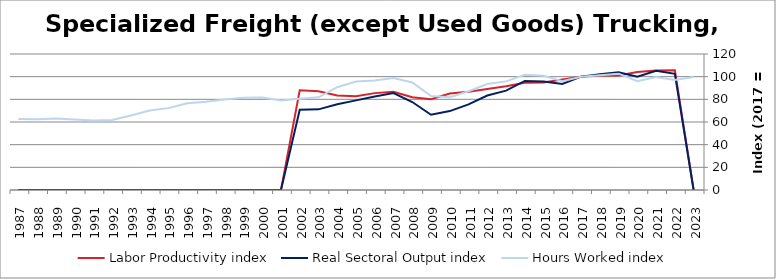
| Category | Labor Productivity index | Real Sectoral Output index | Hours Worked index |
|---|---|---|---|
| 2023.0 | 0 | 0 | 99.659 |
| 2022.0 | 105.584 | 102.556 | 97.131 |
| 2021.0 | 105.483 | 105.259 | 99.788 |
| 2020.0 | 104.042 | 99.897 | 96.016 |
| 2019.0 | 101.125 | 103.822 | 102.668 |
| 2018.0 | 101.011 | 102.232 | 101.209 |
| 2017.0 | 100 | 100 | 100 |
| 2016.0 | 97.563 | 93.574 | 95.912 |
| 2015.0 | 94.936 | 95.652 | 100.754 |
| 2014.0 | 94.641 | 96.196 | 101.643 |
| 2013.0 | 91.489 | 87.679 | 95.835 |
| 2012.0 | 89.123 | 83.354 | 93.527 |
| 2011.0 | 86.691 | 75.537 | 87.134 |
| 2010.0 | 85.14 | 69.621 | 81.772 |
| 2009.0 | 80.138 | 66.419 | 82.88 |
| 2008.0 | 81.829 | 77.625 | 94.862 |
| 2007.0 | 86.584 | 85.576 | 98.836 |
| 2006.0 | 85.477 | 82.554 | 96.58 |
| 2005.0 | 82.634 | 79.064 | 95.68 |
| 2004.0 | 83.434 | 75.682 | 90.709 |
| 2003.0 | 87.035 | 71.166 | 81.767 |
| 2002.0 | 87.937 | 70.826 | 80.541 |
| 2001.0 | 0 | 0 | 78.973 |
| 2000.0 | 0 | 0 | 81.705 |
| 1999.0 | 0 | 0 | 81.327 |
| 1998.0 | 0 | 0 | 79.767 |
| 1997.0 | 0 | 0 | 77.769 |
| 1996.0 | 0 | 0 | 76.612 |
| 1995.0 | 0 | 0 | 72.237 |
| 1994.0 | 0 | 0 | 70.163 |
| 1993.0 | 0 | 0 | 65.712 |
| 1992.0 | 0 | 0 | 61.705 |
| 1991.0 | 0 | 0 | 61.337 |
| 1990.0 | 0 | 0 | 62.303 |
| 1989.0 | 0 | 0 | 63.004 |
| 1988.0 | 0 | 0 | 62.448 |
| 1987.0 | 0 | 0 | 62.657 |